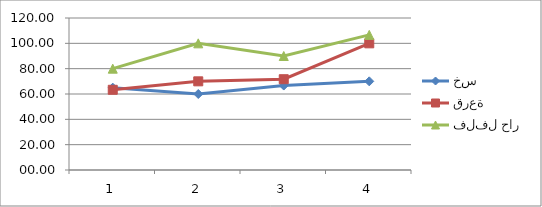
| Category | خس | قرعة | فلفل حار |
|---|---|---|---|
| 0 | 65 | 63.33 | 80 |
| 1 | 60 | 70 | 100 |
| 2 | 66.67 | 71.67 | 90 |
| 3 | 70 | 100 | 106.67 |